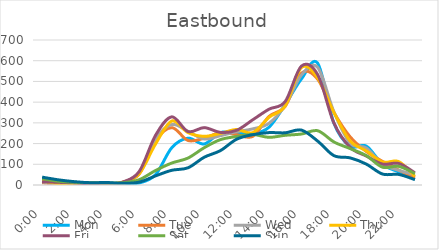
| Category | Mon | Tue | Wed | Thu | Fri | Sat | Sun |
|---|---|---|---|---|---|---|---|
| 0.0 | 28 | 11 | 15 | 20 | 16 | 31 | 38 |
| 0.041667 | 17 | 5 | 5 | 6 | 13 | 18 | 25 |
| 0.083333 | 9 | 3 | 10 | 4 | 10 | 13 | 16 |
| 0.125 | 3 | 9 | 4 | 3 | 5 | 11 | 11 |
| 0.166667 | 5 | 4 | 5 | 5 | 3 | 10 | 12 |
| 0.208333 | 7 | 14 | 5 | 14 | 15 | 11 | 8 |
| 0.25 | 10 | 54 | 61 | 55 | 66 | 26 | 14 |
| 0.291667 | 50 | 214 | 223 | 198 | 240 | 70 | 44 |
| 0.333333 | 180 | 277 | 292 | 309 | 329 | 106 | 71 |
| 0.375 | 226 | 215 | 259 | 253 | 258 | 130 | 83 |
| 0.416667 | 198 | 226 | 222 | 235 | 277 | 180 | 134 |
| 0.458333 | 253 | 253 | 238 | 249 | 254 | 219 | 166 |
| 0.5 | 252 | 243 | 257 | 268 | 264 | 234 | 221 |
| 0.541667 | 247 | 235 | 271 | 253 | 315 | 244 | 243 |
| 0.5833333333333334 | 279 | 331 | 298 | 327 | 366 | 230 | 253 |
| 0.625 | 389 | 380 | 385 | 382 | 403 | 240 | 252 |
| 0.666667 | 512 | 540 | 531 | 567 | 574 | 246 | 265 |
| 0.708333 | 588 | 511 | 568 | 517 | 533 | 262 | 212 |
| 0.75 | 299 | 351 | 354 | 351 | 300 | 208 | 142 |
| 0.791667 | 187 | 233 | 202 | 213 | 182 | 176 | 131 |
| 0.833333 | 188 | 162 | 179 | 165 | 140 | 142 | 101 |
| 0.875 | 100 | 114 | 100 | 111 | 101 | 86 | 53 |
| 0.916667 | 63 | 72 | 71 | 113 | 104 | 90 | 51 |
| 0.958333 | 28 | 35 | 49 | 42 | 59 | 55 | 26 |